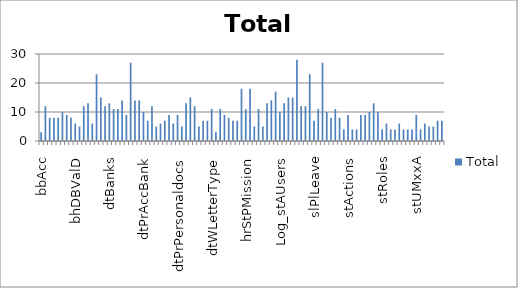
| Category | Total |
|---|---|
| bbAcc | 3 |
| bbCard | 12 |
| bbCR | 8 |
| bbDB | 8 |
| bbDocs | 8 |
| bdAcc | 10 |
| bdClients | 9 |
| bhDBVal | 8 |
| bhDBValD | 6 |
| bhInsuranceAccrual | 5 |
| bhInsuranceAccrualD | 12 |
| dcCards | 13 |
| dcOwners | 6 |
| dcPerson | 23 |
| DimDate | 15 |
| dtAny | 12 |
| dtBanks | 13 |
| dtCity | 11 |
| dtCurrency | 11 |
| dtDep | 14 |
| dtInsurance | 9 |
| dtPerson | 27 |
| dtPlace | 14 |
| dtPost | 14 |
| dtPrAccBank | 10 |
| dtPrAddress | 7 |
| dtPrEducation | 12 |
| dtPrEmail | 5 |
| dtPrFamily | 6 |
| dtPrIncident | 7 |
| dtPrInsurance | 9 |
| dtPrLanguage | 6 |
| dtPrPersonaldocs | 9 |
| dtPrPhone | 5 |
| dtPrPictures | 13 |
| dtPrTraining | 15 |
| dtPRType | 12 |
| dtPrWebPage | 5 |
| dtPrWorking | 7 |
| dtRate | 7 |
| dtWLetterType | 11 |
| dxInfo | 3 |
| faGroup | 11 |
| faGroupTax | 9 |
| flFiles | 8 |
| flPattern | 7 |
| flPatternAny | 7 |
| hrStPHTab | 18 |
| hrStPMission | 11 |
| hrStPTab | 18 |
| hrStPTabAdd | 5 |
| hrStTab | 11 |
| hrStTabAdd | 5 |
| hrStWrit | 13 |
| hrStWritAny | 14 |
| Log_slStPTabDays | 17 |
| Log_stAUsers | 10 |
| pdCat | 13 |
| pdIntCode | 15 |
| pdProducer | 15 |
| pdProducts | 28 |
| psdCat | 12 |
| psdServices | 12 |
| ref_book | 23 |
| slPlLeave | 7 |
| slRoll | 11 |
| slRollD | 27 |
| slRPay | 10 |
| slRPayD | 8 |
| slStPTabDays | 11 |
| sltsw | 8 |
| sltswd | 4 |
| stActions | 9 |
| stARoles | 4 |
| stAUsers | 4 |
| stCaptions | 9 |
| stDBLog | 9 |
| stErrorLog | 10 |
| stFixVal | 13 |
| stLayout | 10 |
| stRoles | 4 |
| stSysMessages | 6 |
| stUMURx | 4 |
| stUMUxA | 4 |
| stUMUxx | 6 |
| stUMUxxL | 4 |
| stUMxRA | 4 |
| stUMxRx | 4 |
| stUMxxA | 9 |
| stURoles | 4 |
| stUsers | 6 |
| sysdiagrams | 5 |
| tdBlob | 5 |
| txCert | 7 |
| txCertA | 7 |